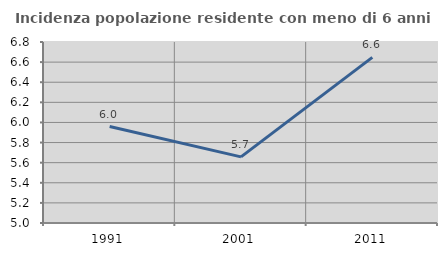
| Category | Incidenza popolazione residente con meno di 6 anni |
|---|---|
| 1991.0 | 5.959 |
| 2001.0 | 5.658 |
| 2011.0 | 6.647 |